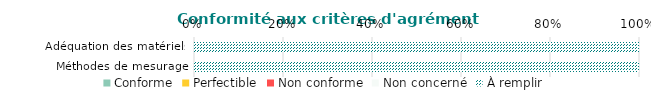
| Category | Conforme | Perfectible | Non conforme | Non concerné | À remplir |
|---|---|---|---|---|---|
| Adéquation des matériels | 0 | 0 | 0 | 0 | 1 |
| Méthodes de mesurage | 0 | 0 | 0 | 0 | 1 |